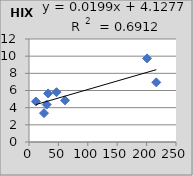
| Category | HIX |
|---|---|
| 25.5 | 3.36 |
| 61.3 | 4.85 |
| 11.7 | 4.72 |
| 216.5 | 6.95 |
| 46.8 | 5.8 |
| 32.5 | 5.66 |
| 200.8 | 9.74 |
| 30.1 | 4.36 |